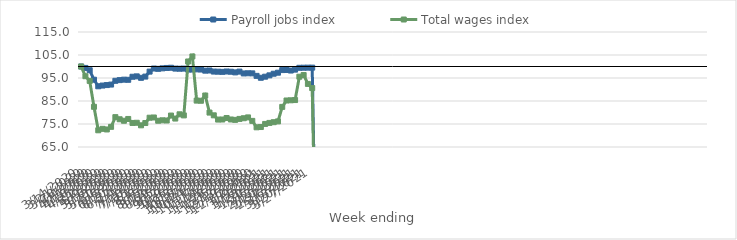
| Category | Payroll jobs index | Total wages index |
|---|---|---|
| 14/03/2020 | 100 | 100 |
| 21/03/2020 | 99.376 | 95.768 |
| 28/03/2020 | 98.373 | 93.731 |
| 04/04/2020 | 94.259 | 82.476 |
| 11/04/2020 | 91.393 | 72.266 |
| 18/04/2020 | 91.715 | 72.894 |
| 25/04/2020 | 91.928 | 72.627 |
| 02/05/2020 | 92.146 | 73.77 |
| 09/05/2020 | 93.779 | 77.977 |
| 16/05/2020 | 94.077 | 77.059 |
| 23/05/2020 | 94.278 | 76.409 |
| 30/05/2020 | 94.217 | 77.192 |
| 06/06/2020 | 95.54 | 75.449 |
| 13/06/2020 | 95.712 | 75.534 |
| 20/06/2020 | 95.076 | 74.423 |
| 27/06/2020 | 95.613 | 75.422 |
| 04/07/2020 | 97.776 | 77.735 |
| 11/07/2020 | 99.123 | 77.834 |
| 18/07/2020 | 98.982 | 76.416 |
| 25/07/2020 | 99.198 | 76.607 |
| 01/08/2020 | 99.365 | 76.519 |
| 08/08/2020 | 99.456 | 78.669 |
| 15/08/2020 | 99.088 | 77.365 |
| 22/08/2020 | 99.03 | 79.215 |
| 29/08/2020 | 99.088 | 78.742 |
| 05/09/2020 | 98.662 | 102.184 |
| 12/09/2020 | 98.666 | 104.368 |
| 19/09/2020 | 98.751 | 85.172 |
| 26/09/2020 | 98.681 | 85.102 |
| 03/10/2020 | 98.188 | 87.393 |
| 10/10/2020 | 98.268 | 79.961 |
| 17/10/2020 | 97.792 | 78.776 |
| 24/10/2020 | 97.741 | 76.923 |
| 31/10/2020 | 97.668 | 76.951 |
| 07/11/2020 | 97.826 | 77.611 |
| 14/11/2020 | 97.719 | 76.964 |
| 21/11/2020 | 97.435 | 76.795 |
| 28/11/2020 | 97.777 | 77.209 |
| 05/12/2020 | 96.983 | 77.507 |
| 12/12/2020 | 97.056 | 77.867 |
| 19/12/2020 | 97.013 | 76.353 |
| 26/12/2020 | 95.926 | 73.561 |
| 02/01/2021 | 95.1 | 73.688 |
| 09/01/2021 | 95.564 | 75.03 |
| 16/01/2021 | 96.154 | 75.475 |
| 23/01/2021 | 96.861 | 75.786 |
| 30/01/2021 | 97.304 | 76.128 |
| 06/02/2021 | 98.443 | 82.442 |
| 13/02/2021 | 98.481 | 85.222 |
| 20/02/2021 | 98.244 | 85.309 |
| 27/02/2021 | 98.638 | 85.412 |
| 06/03/2021 | 99.436 | 95.57 |
| 13/03/2021 | 99.475 | 96.288 |
| 20/03/2021 | 99.501 | 92.427 |
| 27/03/2021 | 99.509 | 90.628 |